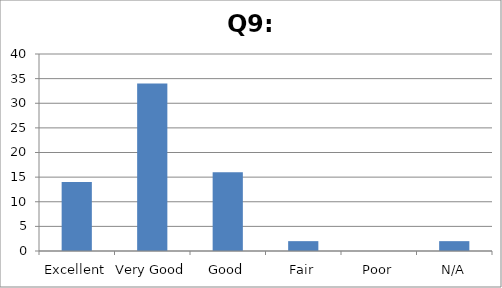
| Category | Response count |
|---|---|
| Excellent | 14 |
| Very Good | 34 |
| Good | 16 |
| Fair | 2 |
| Poor | 0 |
| N/A | 2 |